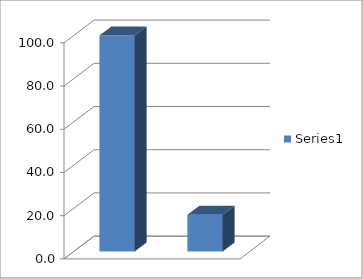
| Category | Series 0 |
|---|---|
| 0 | 100 |
| 1 | 17 |